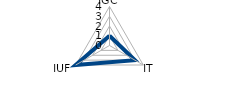
| Category | Series 0 |
|---|---|
| IGC | 1 |
| IT | 3 |
| IUF | 4 |